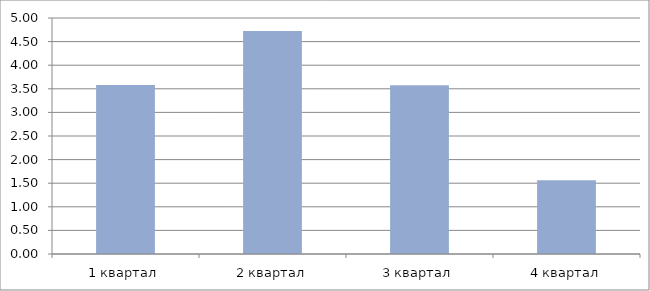
| Category | Рентабельность заемных средств  |
|---|---|
| 1 квартал | 3.582 |
| 2 квартал | 4.726 |
| 3 квартал | 3.576 |
| 4 квартал | 1.564 |